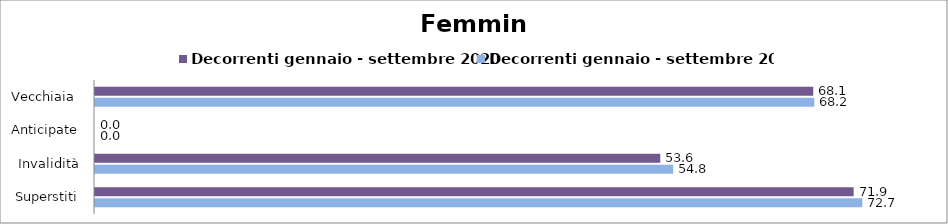
| Category | Decorrenti gennaio - settembre 2020 | Decorrenti gennaio - settembre 2021 |
|---|---|---|
| Vecchiaia  | 68.08 | 68.18 |
| Anticipate | 0 | 0 |
| Invalidità | 53.58 | 54.8 |
| Superstiti | 71.91 | 72.73 |